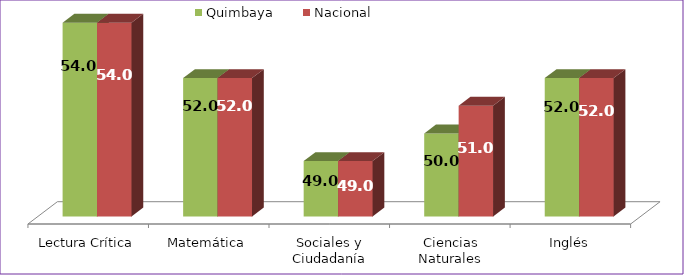
| Category | Quimbaya | Nacional |
|---|---|---|
| Lectura Crítica | 54 | 54 |
| Matemática | 52 | 52 |
| Sociales y Ciudadanía | 49 | 49 |
| Ciencias Naturales | 50 | 51 |
| Inglés | 52 | 52 |